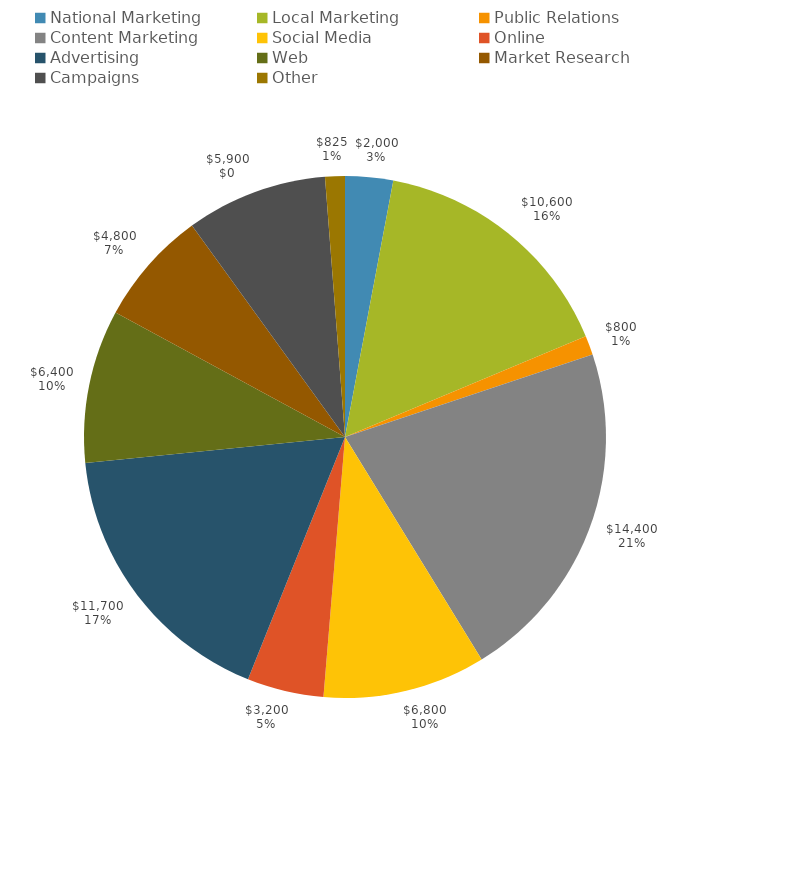
| Category | Series 0 | Series 1 |
|---|---|---|
| National Marketing | 2000 | 0.03 |
| Local Marketing | 10600 | 0.157 |
| Public Relations | 800 | 0.012 |
| Content Marketing | 14400 | 0.214 |
| Social Media | 6800 | 0.101 |
| Online | 3200 | 0.047 |
| Advertising | 11700 | 0.174 |
| Web | 6400 | 0.095 |
| Market Research | 4800 | 0.071 |
| Campaigns | 5900 | 0.088 |
| Other | 825 | 0.012 |